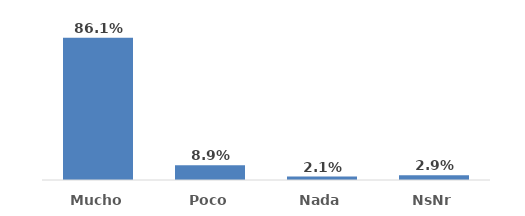
| Category | Series 0 |
|---|---|
| Mucho  | 0.861 |
| Poco | 0.089 |
| Nada | 0.021 |
| NsNr | 0.029 |